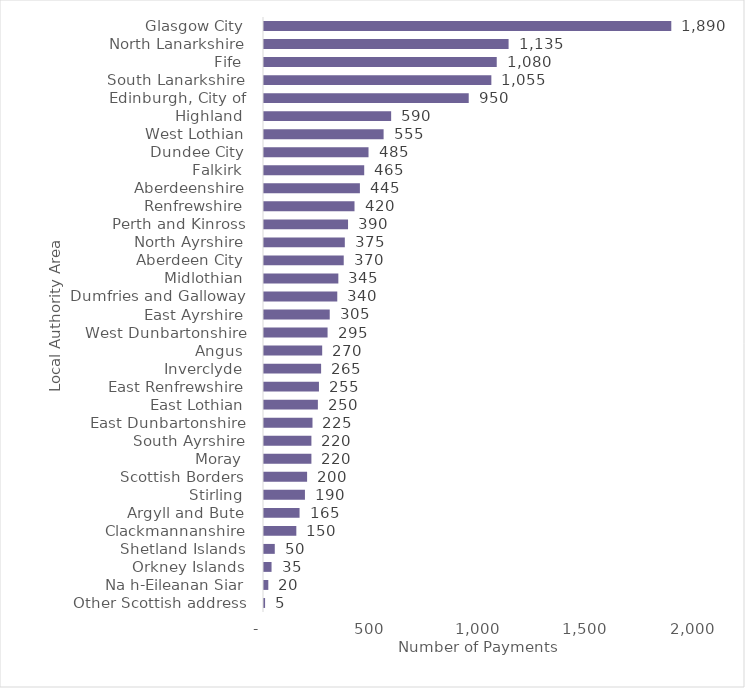
| Category | Number of Payments |
|---|---|
| Other Scottish address | 5 |
| Na h-Eileanan Siar | 20 |
| Orkney Islands | 35 |
| Shetland Islands | 50 |
| Clackmannanshire | 150 |
| Argyll and Bute | 165 |
| Stirling | 190 |
| Scottish Borders | 200 |
| Moray | 220 |
| South Ayrshire | 220 |
| East Dunbartonshire | 225 |
| East Lothian | 250 |
| East Renfrewshire | 255 |
| Inverclyde | 265 |
| Angus | 270 |
| West Dunbartonshire | 295 |
| East Ayrshire | 305 |
| Dumfries and Galloway | 340 |
| Midlothian | 345 |
| Aberdeen City | 370 |
| North Ayrshire | 375 |
| Perth and Kinross | 390 |
| Renfrewshire | 420 |
| Aberdeenshire | 445 |
| Falkirk | 465 |
| Dundee City | 485 |
| West Lothian | 555 |
| Highland | 590 |
| Edinburgh, City of | 950 |
| South Lanarkshire | 1055 |
| Fife | 1080 |
| North Lanarkshire | 1135 |
| Glasgow City | 1890 |